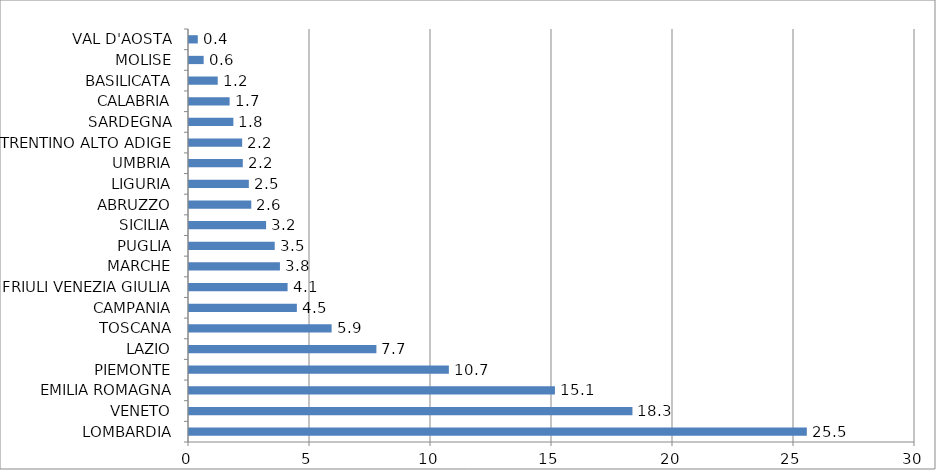
| Category | Series 0 |
|---|---|
| LOMBARDIA | 25.53 |
| VENETO | 18.324 |
| EMILIA ROMAGNA | 15.121 |
| PIEMONTE | 10.738 |
| LAZIO | 7.744 |
| TOSCANA | 5.894 |
| CAMPANIA | 4.457 |
| FRIULI VENEZIA GIULIA | 4.074 |
| MARCHE | 3.758 |
| PUGLIA | 3.542 |
| SICILIA | 3.186 |
| ABRUZZO | 2.574 |
| LIGURIA | 2.473 |
| UMBRIA | 2.224 |
| TRENTINO ALTO ADIGE | 2.197 |
| SARDEGNA | 1.833 |
| CALABRIA | 1.679 |
| BASILICATA | 1.188 |
| MOLISE | 0.606 |
| VAL D'AOSTA | 0.363 |